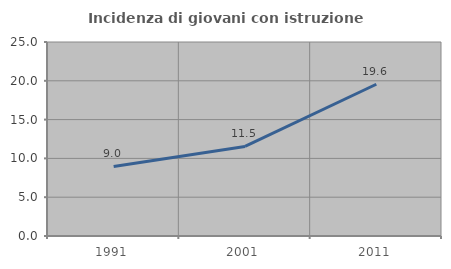
| Category | Incidenza di giovani con istruzione universitaria |
|---|---|
| 1991.0 | 8.969 |
| 2001.0 | 11.538 |
| 2011.0 | 19.553 |